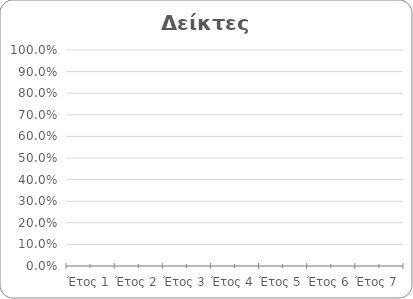
| Category | Series 0 | Series 1 | Series 2 | Series 3 |
|---|---|---|---|---|
| Έτος 1 | 0 | 0 | 0 | 0 |
| Έτος 2 | 0 | 0 | 0 | 0 |
| Έτος 3 | 0 | 0 | 0 | 0 |
| Έτος 4 | 0 | 0 | 0 | 0 |
| Έτος 5 | 0 | 0 | 0 | 0 |
| Έτος 6 | 0 | 0 | 0 | 0 |
| Έτος 7 | 0 | 0 | 0 | 0 |